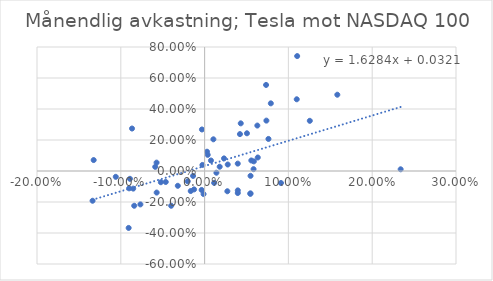
| Category | Series 0 |
|---|---|
| -0.01375109892244445 | -0.032 |
| -0.03987062362679847 | -0.224 |
| 0.0037136479601526788 | 0.104 |
| 0.054826457065779315 | -0.031 |
| 0.010486916111847133 | 0.204 |
| 0.027153164413134784 | -0.131 |
| 0.05843074787264354 | 0.012 |
| -0.003514249694626143 | -0.122 |
| -0.08659941135212015 | 0.274 |
| -0.002596489213589606 | 0.039 |
| -0.08908463219940685 | -0.05 |
| 0.09113485709230391 | -0.077 |
| 0.0276088630980303 | 0.042 |
| 0.03962505265916463 | -0.125 |
| 0.054574136339796415 | -0.147 |
| -0.08398166924972948 | -0.224 |
| 0.07619431085471856 | 0.207 |
| 0.02316625972647884 | 0.081 |
| -0.02010248726553678 | -0.066 |
| 0.0075997919646339646 | 0.068 |
| 0.04314886862938662 | 0.307 |
| 0.03956664105999265 | 0.048 |
| -0.00316646992746042 | 0.268 |
| 0.07334784119029691 | 0.555 |
| -0.05890890406616912 | 0.027 |
| -0.07661817833731001 | -0.216 |
| 0.15837972739489345 | 0.492 |
| 0.055741906971605394 | 0.068 |
| 0.06293011787950838 | 0.293 |
| 0.07374628944997699 | 0.325 |
| 0.11047434961690406 | 0.741 |
| -0.05719240010899462 | -0.139 |
| -0.03197653541845101 | -0.095 |
| 0.10995887975608312 | 0.463 |
| 0.05053340636696801 | 0.243 |
| 0.0028785842641530558 | 0.125 |
| -0.001233232601285122 | -0.149 |
| 0.014098210301918596 | -0.011 |
| 0.058765116748042974 | 0.062 |
| -0.01257146072798317 | -0.119 |
| 0.06344130095985018 | 0.087 |
| 0.23395031192458862 | 0.011 |
| -0.13237211788484352 | 0.071 |
| -0.05730078145305213 | 0.054 |
| 0.07902518921524168 | 0.437 |
| 0.01800892970366183 | 0.028 |
| 0.011413046172762375 | -0.077 |
| -0.08517298934809148 | -0.114 |
| -0.04636555135448306 | -0.071 |
| 0.0421890726172073 | 0.238 |
| -0.13368543564742777 | -0.192 |
| -0.01654634844571669 | -0.129 |
| -0.09004674856234336 | -0.112 |
| 0.1255463450083973 | 0.324 |
| -0.05220432237640331 | -0.072 |
| -0.1059979481797226 | -0.038 |
| 0.039589945329689895 | -0.142 |
| 0.05475307240234375 | -0.144 |
| -0.09063130192201863 | -0.367 |